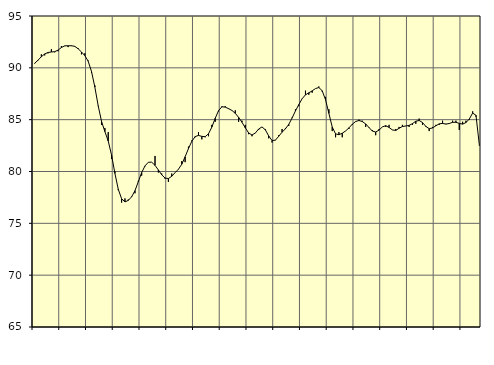
| Category | Piggar | Series 1 |
|---|---|---|
| nan | 90.4 | 90.44 |
| 87.0 | 90.7 | 90.74 |
| 87.0 | 91.3 | 91.07 |
| 87.0 | 91.2 | 91.34 |
| nan | 91.4 | 91.48 |
| 88.0 | 91.8 | 91.53 |
| 88.0 | 91.5 | 91.56 |
| 88.0 | 91.6 | 91.71 |
| nan | 92.1 | 91.96 |
| 89.0 | 92.1 | 92.12 |
| 89.0 | 92 | 92.13 |
| 89.0 | 92.1 | 92.13 |
| nan | 92.1 | 92.07 |
| 90.0 | 91.9 | 91.84 |
| 90.0 | 91.3 | 91.53 |
| 90.0 | 91.4 | 91.18 |
| nan | 90.7 | 90.64 |
| 91.0 | 89.5 | 89.65 |
| 91.0 | 88.3 | 88.14 |
| 91.0 | 86.3 | 86.34 |
| nan | 84.5 | 84.83 |
| 92.0 | 84.2 | 83.85 |
| 92.0 | 83.8 | 82.94 |
| 92.0 | 81.2 | 81.58 |
| nan | 80 | 79.82 |
| 93.0 | 78.2 | 78.29 |
| 93.0 | 77 | 77.37 |
| 93.0 | 77.4 | 77.07 |
| nan | 77.3 | 77.21 |
| 94.0 | 77.6 | 77.56 |
| 94.0 | 77.9 | 78.15 |
| 94.0 | 79.1 | 79.02 |
| nan | 79.6 | 79.9 |
| 95.0 | 80.5 | 80.54 |
| 95.0 | 80.9 | 80.89 |
| 95.0 | 80.9 | 80.9 |
| nan | 81.5 | 80.59 |
| 96.0 | 79.9 | 80.15 |
| 96.0 | 79.8 | 79.68 |
| 96.0 | 79.3 | 79.37 |
| nan | 79 | 79.32 |
| 97.0 | 79.8 | 79.54 |
| 97.0 | 79.9 | 79.89 |
| 97.0 | 80.2 | 80.22 |
| nan | 81 | 80.7 |
| 98.0 | 80.9 | 81.42 |
| 98.0 | 82.4 | 82.21 |
| 98.0 | 83 | 82.91 |
| nan | 83.3 | 83.37 |
| 99.0 | 83.8 | 83.48 |
| 99.0 | 83.1 | 83.39 |
| 99.0 | 83.3 | 83.36 |
| nan | 83.4 | 83.64 |
| 0.0 | 84.5 | 84.29 |
| 0.0 | 84.8 | 85.13 |
| 0.0 | 85.8 | 85.87 |
| nan | 86.3 | 86.24 |
| 1.0 | 86.3 | 86.21 |
| 1.0 | 86.1 | 86.06 |
| 1.0 | 85.9 | 85.89 |
| nan | 85.9 | 85.61 |
| 2.0 | 84.8 | 85.22 |
| 2.0 | 84.9 | 84.75 |
| 2.0 | 84.5 | 84.21 |
| nan | 83.6 | 83.72 |
| 3.0 | 83.4 | 83.52 |
| 3.0 | 83.7 | 83.71 |
| 3.0 | 84 | 84.1 |
| nan | 84.3 | 84.3 |
| 4.0 | 84.1 | 84.02 |
| 4.0 | 83.2 | 83.43 |
| 4.0 | 82.8 | 82.99 |
| nan | 83 | 83.02 |
| 5.0 | 83.5 | 83.4 |
| 5.0 | 84.1 | 83.79 |
| 5.0 | 84.2 | 84.12 |
| nan | 84.4 | 84.54 |
| 6.0 | 85.2 | 85.16 |
| 6.0 | 86 | 85.84 |
| 6.0 | 86.3 | 86.45 |
| nan | 87 | 87.02 |
| 7.0 | 87.8 | 87.4 |
| 7.0 | 87.4 | 87.59 |
| 7.0 | 87.6 | 87.78 |
| nan | 88 | 88 |
| 8.0 | 88.2 | 88.1 |
| 8.0 | 87.7 | 87.79 |
| 8.0 | 87.2 | 86.92 |
| nan | 86 | 85.61 |
| 9.0 | 83.9 | 84.29 |
| 9.0 | 83.3 | 83.63 |
| 9.0 | 83.8 | 83.55 |
| nan | 83.3 | 83.69 |
| 10.0 | 83.9 | 83.91 |
| 10.0 | 84.1 | 84.21 |
| 10.0 | 84.5 | 84.56 |
| nan | 84.8 | 84.82 |
| 11.0 | 85 | 84.92 |
| 11.0 | 84.9 | 84.82 |
| 11.0 | 84.3 | 84.59 |
| nan | 84.2 | 84.24 |
| 12.0 | 84 | 83.9 |
| 12.0 | 83.5 | 83.81 |
| 12.0 | 84.1 | 83.99 |
| nan | 84.3 | 84.3 |
| 13.0 | 84.3 | 84.42 |
| 13.0 | 84.5 | 84.25 |
| 13.0 | 84 | 84.01 |
| nan | 84.1 | 83.96 |
| 14.0 | 84.3 | 84.17 |
| 14.0 | 84.5 | 84.34 |
| 14.0 | 84.4 | 84.39 |
| nan | 84.3 | 84.45 |
| 15.0 | 84.5 | 84.62 |
| 15.0 | 84.6 | 84.85 |
| 15.0 | 85.1 | 84.92 |
| nan | 84.5 | 84.72 |
| 16.0 | 84.3 | 84.35 |
| 16.0 | 83.9 | 84.13 |
| 16.0 | 84.3 | 84.2 |
| nan | 84.5 | 84.41 |
| 17.0 | 84.5 | 84.6 |
| 17.0 | 84.9 | 84.64 |
| 17.0 | 84.6 | 84.57 |
| nan | 84.6 | 84.63 |
| 18.0 | 84.9 | 84.74 |
| 18.0 | 84.9 | 84.75 |
| 18.0 | 84 | 84.64 |
| nan | 84.8 | 84.57 |
| 19.0 | 84.9 | 84.72 |
| 19.0 | 85 | 85.06 |
| 19.0 | 85.8 | 85.64 |
| nan | 85.3 | 85.42 |
| 20.0 | 82.5 | 82.56 |